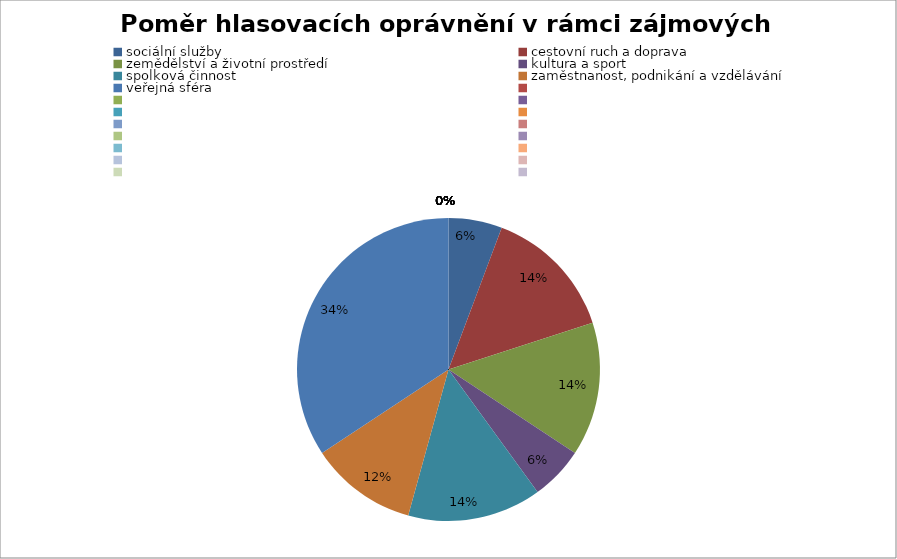
| Category | Series 0 |
|---|---|
| sociální služby | 0.057 |
| cestovní ruch a doprava | 0.143 |
| zemědělství a životní prostředí | 0.143 |
| kultura a sport | 0.057 |
| spolková činnost | 0.143 |
| zaměstnanost, podnikání a vzdělávání | 0.114 |
| veřejná sféra | 0.343 |